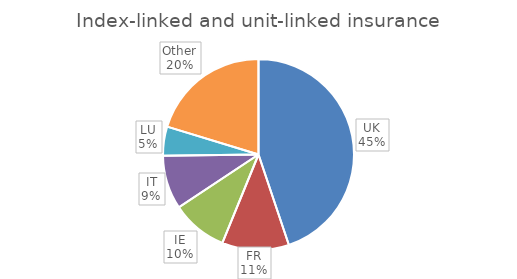
| Category | Index-linked and unit-linked insurance |
|---|---|
| UK | 160639.54 |
| FR | 40579.36 |
| IE | 34072.13 |
| IT | 32688.81 |
| LU | 17547.66 |
| Other | 72691.41 |